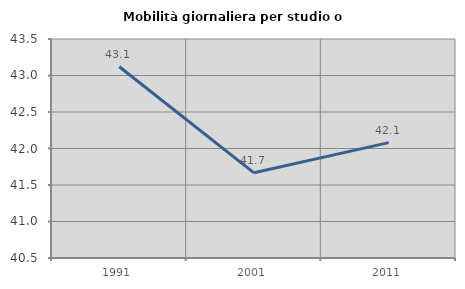
| Category | Mobilità giornaliera per studio o lavoro |
|---|---|
| 1991.0 | 43.12 |
| 2001.0 | 41.667 |
| 2011.0 | 42.08 |